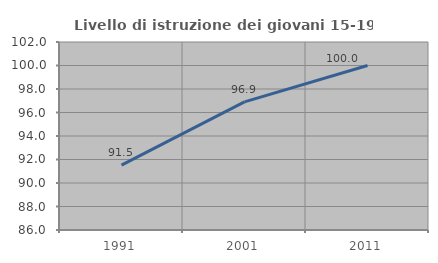
| Category | Livello di istruzione dei giovani 15-19 anni |
|---|---|
| 1991.0 | 91.515 |
| 2001.0 | 96.904 |
| 2011.0 | 100 |